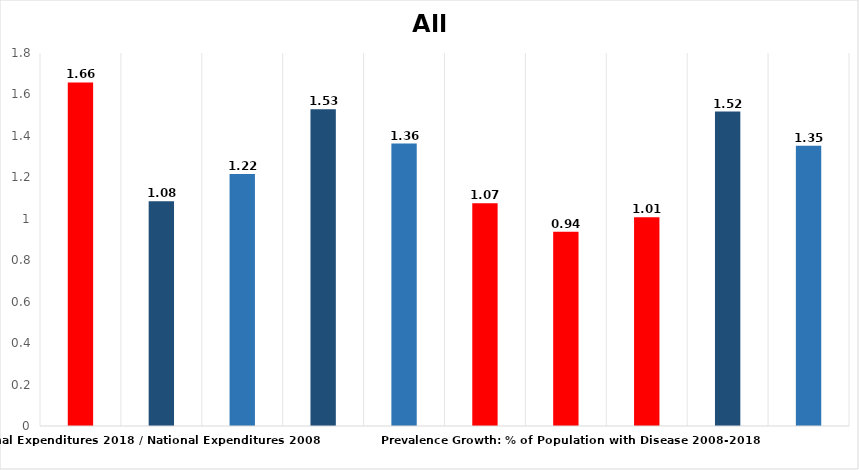
| Category | All Disease |
|---|---|
| Nominal Growth: National Expenditures 2018 / National Expenditures 2008 | 1.658 |
| Price Index Growth: Yearly All Disease Utilization Adjusted Price Index with Adjusted Quantity (DBPI) 2008-2018 | 1.084 |
| Price Index Growth: Yearly All Disease Utilization Adjusted Price Index with Fixed Quantity (LOWE) 2008-2018 | 1.217 |
| Real Utilization Adjusted DBPI Growth in 2008 dollars: Nominal Expenditure Growth / DBPI Growth | 1.529 |
| Real Utilization Adjusted LOWE Growth in 2008 dollars: Nominal Expenditure Growth / LOWE Index Growth | 1.363 |
| Population Growth Rate: US Population 2018 / US Population 2008 | 1.075 |
| Prevalence Growth: % of Population with Disease 2008-2018 | 0.937 |
| Growth in Population Treated for Disease 2008-2018 | 1.008 |
| Utilization Adjusted DBPI- Real Output Per Treated Growth: Real Dollars per Treated 2008-2018 | 1.517 |
| Utilization Adjusted LOWE Index - Real Output Per Treated Growth: Real Dollars per Treated 2008-2018 | 1.352 |